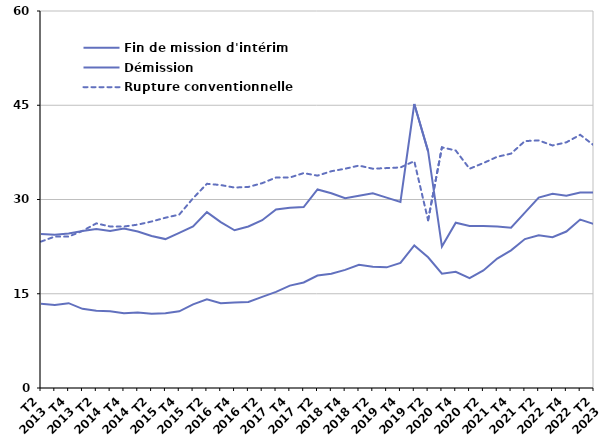
| Category | Fin de mission d'intérim | Démission | Rupture conventionnelle |
|---|---|---|---|
| T2
2013 | 24.5 | 13.4 | 23.3 |
| T3
2013 | 24.4 | 13.2 | 24.1 |
| T4
2013 | 24.6 | 13.5 | 24.1 |
| T1
2014 | 25 | 12.6 | 25 |
| T2
2014 | 25.3 | 12.3 | 26.2 |
| T3
2014 | 25 | 12.2 | 25.7 |
| T4
2014 | 25.4 | 11.9 | 25.7 |
| T1
2015 | 24.9 | 12 | 26 |
| T2
2015 | 24.2 | 11.8 | 26.5 |
| T3
2015 | 23.7 | 11.9 | 27.1 |
| T4
2015 | 24.7 | 12.2 | 27.6 |
| T1
2016 | 25.7 | 13.3 | 30.2 |
| T2
2016 | 28 | 14.1 | 32.5 |
| T3
2016 | 26.4 | 13.5 | 32.3 |
| T4
2016 | 25.1 | 13.6 | 31.9 |
| T1
2017 | 25.7 | 13.7 | 32 |
| T2
2017 | 26.7 | 14.5 | 32.6 |
| T3
2017 | 28.4 | 15.3 | 33.5 |
| T4
2017 | 28.7 | 16.3 | 33.5 |
| T1
2018 | 28.8 | 16.8 | 34.2 |
| T2
2018 | 31.6 | 17.9 | 33.8 |
| T3
2018 | 31 | 18.2 | 34.5 |
| T4
2018 | 30.2 | 18.8 | 34.9 |
| T1
2019 | 30.6 | 19.6 | 35.4 |
| T2
2019 | 31 | 19.3 | 34.9 |
| T3
2019 | 30.3 | 19.2 | 35 |
| T4
2019 | 29.6 | 19.9 | 35.1 |
| T1
2020 | 45.2 | 22.7 | 36.1 |
| T2
2020 | 37.7 | 20.8 | 26.7 |
| T3
2020 | 22.5 | 18.2 | 38.3 |
| T4
2020 | 26.3 | 18.5 | 37.8 |
| T1
2021 | 25.8 | 17.5 | 34.9 |
| T2
2021 | 25.8 | 18.7 | 35.8 |
| T3
2021 | 25.7 | 20.6 | 36.8 |
| T4
2021 | 25.5 | 21.9 | 37.3 |
| T1
2022 | 27.9 | 23.7 | 39.3 |
| T2
2022 | 30.3 | 24.3 | 39.4 |
| T3
2022 | 30.9 | 24 | 38.6 |
| T4
2022 | 30.6 | 24.9 | 39.1 |
| T1
2023 | 31.1 | 26.8 | 40.3 |
| T2
2023 | 31.1 | 26.1 | 38.6 |